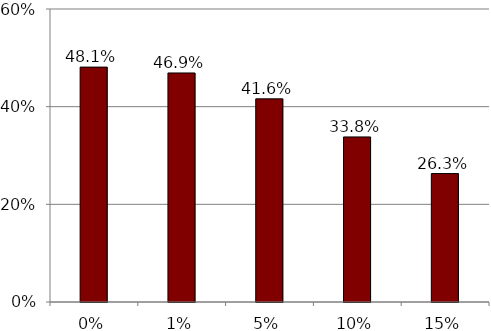
| Category | Series 0 |
|---|---|
| 0.0 | 0.481 |
| 0.01 | 0.469 |
| 0.05 | 0.416 |
| 0.1 | 0.338 |
| 0.15 | 0.263 |